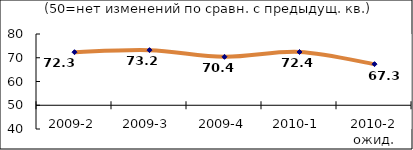
| Category | Диф.индекс ↓ |
|---|---|
| 2009-2 | 72.345 |
| 2009-3 | 73.205 |
| 2009-4 | 70.39 |
| 2010-1 | 72.43 |
| 2010-2 ожид. | 67.305 |